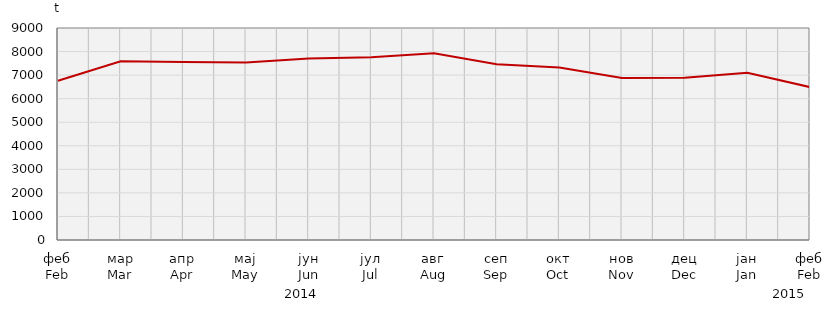
| Category | Series 0 |
|---|---|
| феб
Feb | 6759.17 |
| мар
Mar | 7591.3 |
| апр
Apr | 7558.844 |
| мај
May | 7539.71 |
| јун
Jun | 7705.273 |
| јул
Jul | 7759.37 |
| авг
Aug | 7925.8 |
| сеп
Sep | 7457.865 |
| окт
Oct | 7318.004 |
| нов
Nov | 6875.135 |
| дец
Dec | 6887.315 |
| јан
Jan | 7099.8 |
| феб
Feb | 6490.829 |